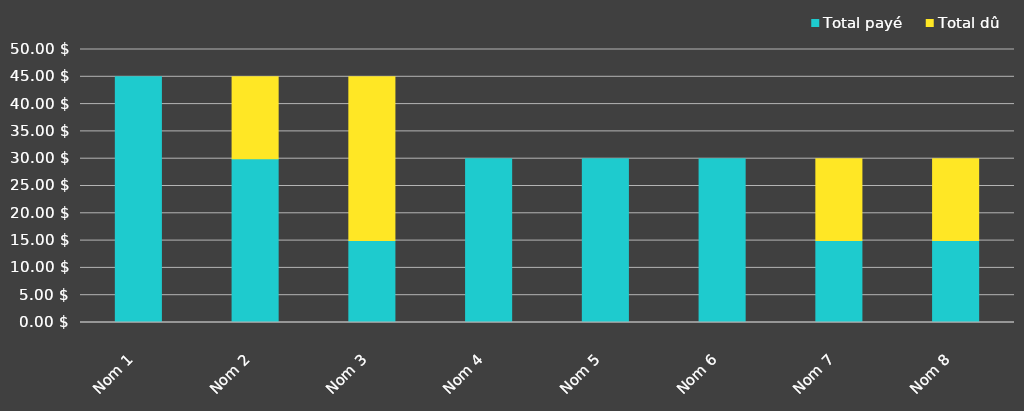
| Category | Total payé | Total dû |
|---|---|---|
| Nom 1 | 45 | 0 |
| Nom 2 | 30 | 15 |
| Nom 3 | 15 | 30 |
| Nom 4 | 30 | 0 |
| Nom 5 | 30 | 0 |
| Nom 6 | 30 | 0 |
| Nom 7 | 15 | 15 |
| Nom 8 | 15 | 15 |